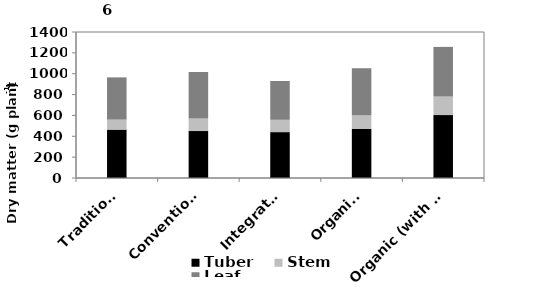
| Category | Tuber  | Stem  | Leaf  |
|---|---|---|---|
| Traditional | 464 | 95.9 | 405 |
| Conventional | 450 | 120.2 | 446 |
| Integrated | 440 | 118.1 | 372 |
| Organic  | 473 | 129.6 | 449 |
| Organic (with biofertilizers) | 603 | 178.1 | 476 |